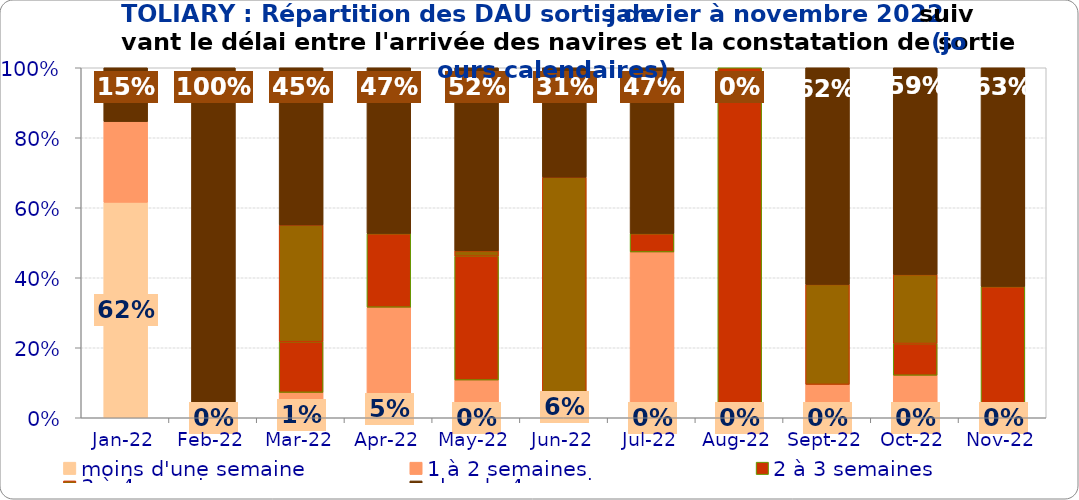
| Category | moins d'une semaine | 1 à 2 semaines | 2 à 3 semaines | 3 à 4 semaines | plus de 4 semaines |
|---|---|---|---|---|---|
| 2022-01-01 | 0.615 | 0.231 | 0 | 0 | 0.154 |
| 2022-02-01 | 0 | 0 | 0 | 0 | 1 |
| 2022-03-01 | 0.014 | 0.058 | 0.145 | 0.333 | 0.449 |
| 2022-04-01 | 0.053 | 0.263 | 0.211 | 0 | 0.474 |
| 2022-05-01 | 0 | 0.108 | 0.354 | 0.015 | 0.523 |
| 2022-06-01 | 0.062 | 0 | 0 | 0.625 | 0.312 |
| 2022-07-01 | 0 | 0.474 | 0.053 | 0 | 0.474 |
| 2022-08-01 | 0 | 0 | 1 | 0 | 0 |
| 2022-09-01 | 0 | 0.095 | 0 | 0.286 | 0.619 |
| 2022-10-01 | 0 | 0.121 | 0.091 | 0.197 | 0.591 |
| 2022-11-01 | 0 | 0 | 0.375 | 0 | 0.625 |